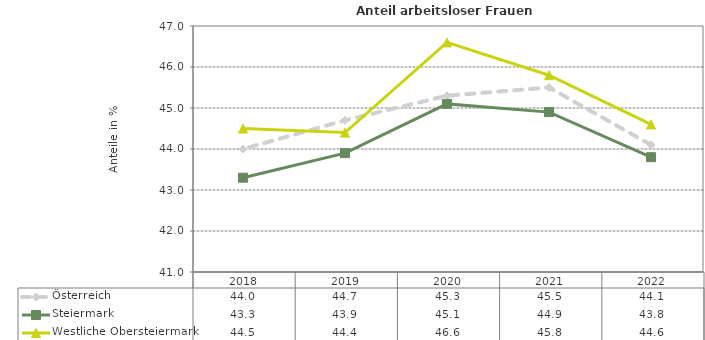
| Category | Österreich | Steiermark | Westliche Obersteiermark |
|---|---|---|---|
| 2022.0 | 44.1 | 43.8 | 44.6 |
| 2021.0 | 45.5 | 44.9 | 45.8 |
| 2020.0 | 45.3 | 45.1 | 46.6 |
| 2019.0 | 44.7 | 43.9 | 44.4 |
| 2018.0 | 44 | 43.3 | 44.5 |